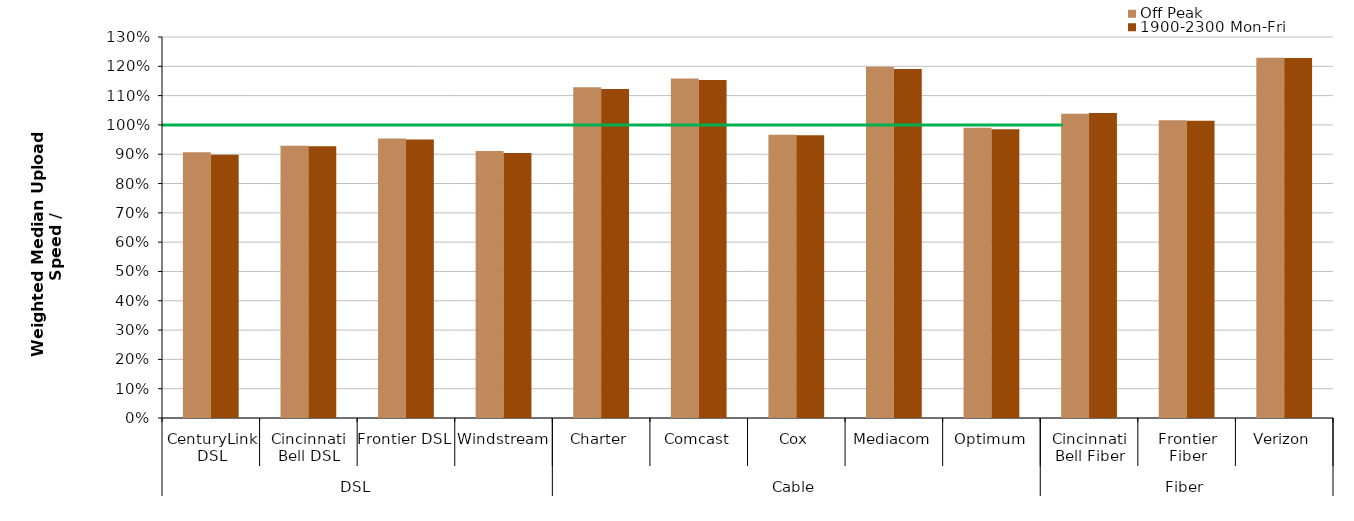
| Category | Off Peak | 1900-2300 Mon-Fri |
|---|---|---|
| 0 | 0.907 | 0.899 |
| 1 | 0.929 | 0.927 |
| 2 | 0.954 | 0.95 |
| 3 | 0.911 | 0.904 |
| 4 | 1.128 | 1.122 |
| 5 | 1.158 | 1.153 |
| 6 | 0.966 | 0.965 |
| 7 | 1.199 | 1.191 |
| 8 | 0.991 | 0.985 |
| 9 | 1.038 | 1.04 |
| 10 | 1.016 | 1.014 |
| 11 | 1.229 | 1.228 |